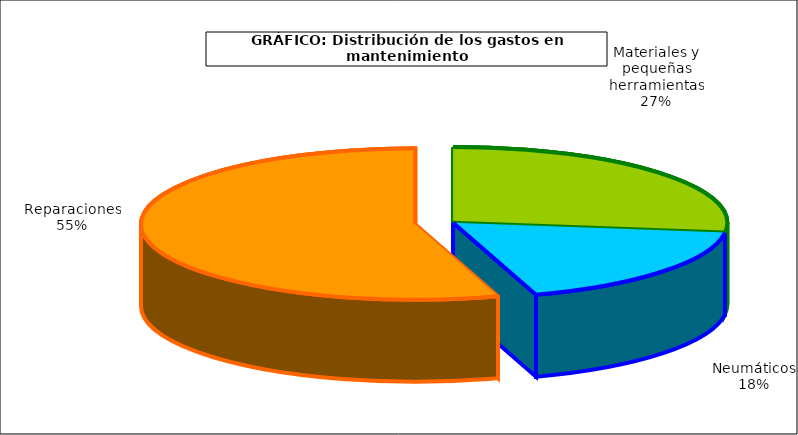
| Category | Series 0 |
|---|---|
| 0 | 459.435 |
| 1 | 305.795 |
| 2 | 930.936 |